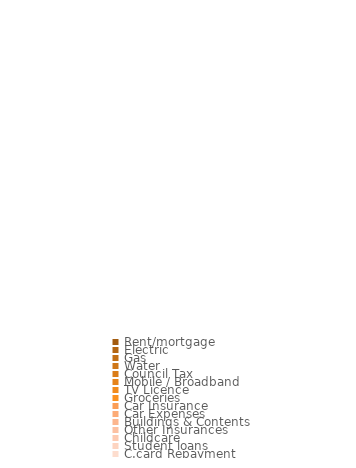
| Category | Series 0 |
|---|---|
| Rent/mortgage | 0 |
| Electric | 0 |
| Gas | 0 |
| Water | 0 |
| Council Tax | 0 |
| Mobile / Broadband | 0 |
| TV Licence  | 0 |
| Groceries | 0 |
| Car Insurance | 0 |
| Car Expenses | 0 |
| Buildings & Contents | 0 |
| Other Insurances | 0 |
| Childcare | 0 |
| Student loans | 0 |
| C.card Repayment | 0 |